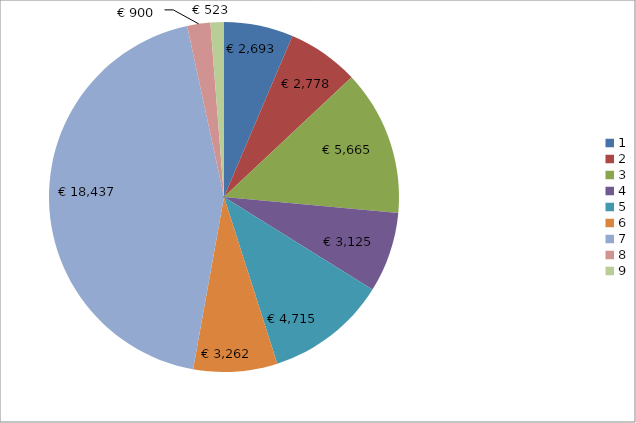
| Category | Series 0 |
|---|---|
| 0 | 2693 |
| 1 | 2778 |
| 2 | 5665 |
| 3 | 3125 |
| 4 | 4715 |
| 5 | 3262 |
| 6 | 18437 |
| 7 | 900 |
| 8 | 523 |